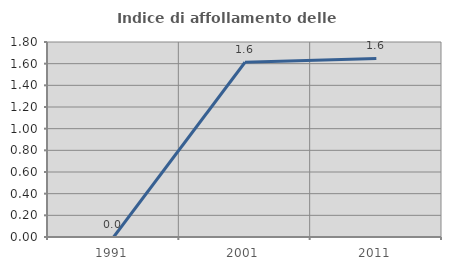
| Category | Indice di affollamento delle abitazioni  |
|---|---|
| 1991.0 | 0 |
| 2001.0 | 1.613 |
| 2011.0 | 1.648 |